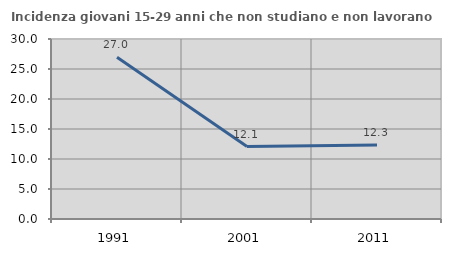
| Category | Incidenza giovani 15-29 anni che non studiano e non lavorano  |
|---|---|
| 1991.0 | 26.971 |
| 2001.0 | 12.074 |
| 2011.0 | 12.346 |